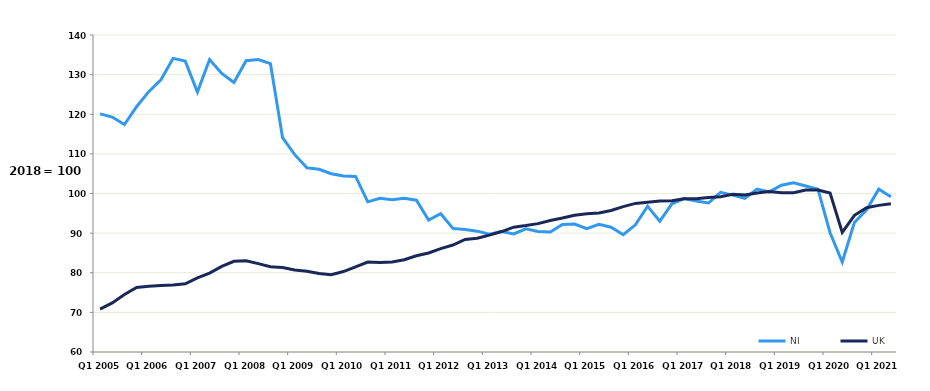
| Category | NI | UK |
|---|---|---|
| Q1 2005 | 120.1 | 70.8 |
|  | 119.3 | 72.4 |
|  | 117.4 | 74.5 |
|  | 121.9 | 76.3 |
| Q1 2006 | 125.7 | 76.6 |
|  | 128.7 | 76.8 |
|  | 134.1 | 76.9 |
|  | 133.4 | 77.2 |
| Q1 2007 | 125.6 | 78.7 |
|  | 133.8 | 79.9 |
|  | 130.3 | 81.6 |
|  | 128 | 82.9 |
| Q1 2008 | 133.5 | 83 |
|  | 133.8 | 82.3 |
|  | 132.8 | 81.5 |
|  | 114.1 | 81.3 |
| Q1 2009 | 109.8 | 80.7 |
|  | 106.5 | 80.4 |
|  | 106.1 | 79.8 |
|  | 105 | 79.5 |
| Q1 2010 | 104.4 | 80.3 |
|  | 104.3 | 81.5 |
|  | 97.9 | 82.7 |
|  | 98.8 | 82.6 |
| Q1 2011 | 98.4 | 82.7 |
|  | 98.8 | 83.3 |
|  | 98.3 | 84.3 |
|  | 93.3 | 85 |
| Q1 2012 | 94.9 | 86.1 |
|  | 91.2 | 87 |
|  | 90.9 | 88.4 |
|  | 90.5 | 88.7 |
| Q1 2013 | 89.7 | 89.5 |
|  | 90.4 | 90.4 |
|  | 89.8 | 91.5 |
|  | 91.1 | 91.9 |
| Q1 2014 | 90.4 | 92.4 |
|  | 90.3 | 93.2 |
|  | 92.2 | 93.8 |
|  | 92.3 | 94.5 |
| Q1 2015 | 91.1 | 94.9 |
|  | 92.2 | 95.1 |
|  | 91.5 | 95.7 |
|  | 89.6 | 96.7 |
| Q1 2016 | 92.1 | 97.5 |
|  | 96.8 | 97.8 |
|  | 93 | 98.1 |
|  | 97.4 | 98.2 |
| Q1 2017 | 98.7 | 98.7 |
|  | 98.1 | 98.7 |
|  | 97.6 | 99 |
|  | 100.3 | 99.2 |
| Q1 2018 | 99.6 | 99.8 |
|  | 98.8 | 99.6 |
|  | 101.1 | 100.1 |
|  | 100.4 | 100.5 |
| Q1 2019 | 102.1 | 100.2 |
|  | 102.7 | 100.2 |
|  | 101.9 | 100.9 |
|  | 101.1 | 100.9 |
| Q1 2020 | 90.1 | 100.1 |
|  | 82.7 | 90.2 |
|  | 92.7 | 94.5 |
|  | 95.9 | 96.4 |
| Q1 2021 | 101.1 | 97 |